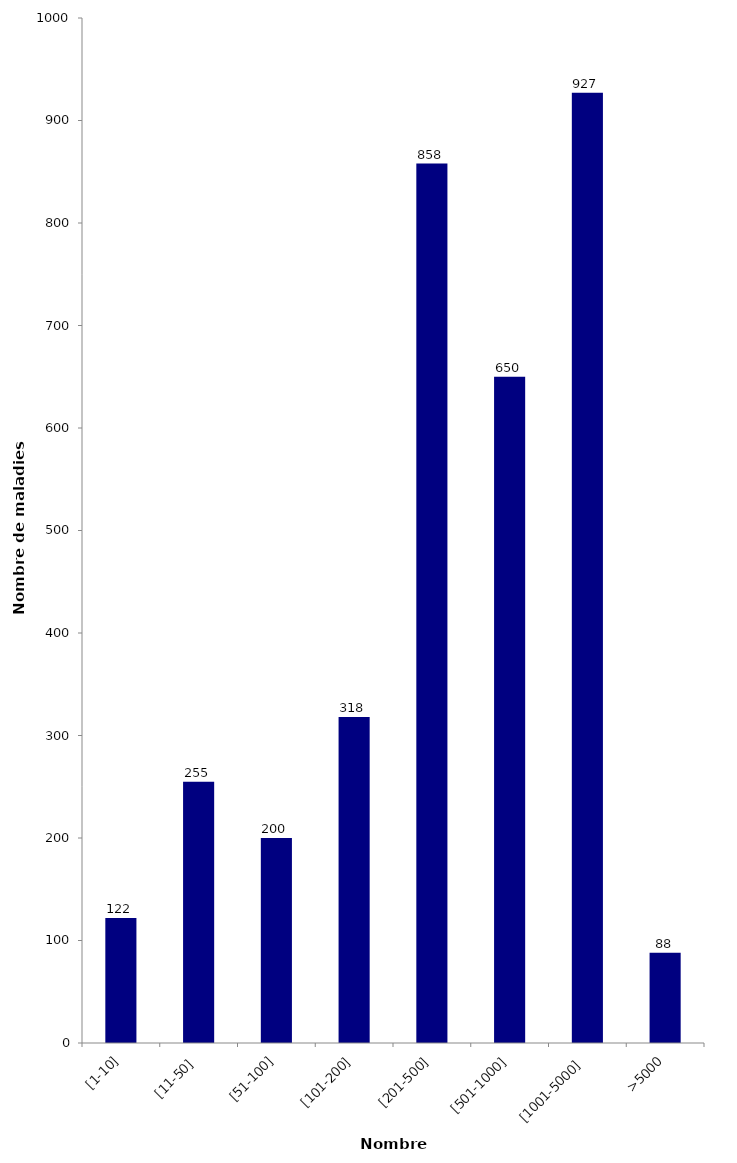
| Category | Nombre d'examens |
|---|---|
| [1-10] | 122 |
| [11-50] | 255 |
| [51-100] | 200 |
| [101-200] | 318 |
| [201-500] | 858 |
| [501-1000] | 650 |
| [1001-5000] | 927 |
| >5000 | 88 |